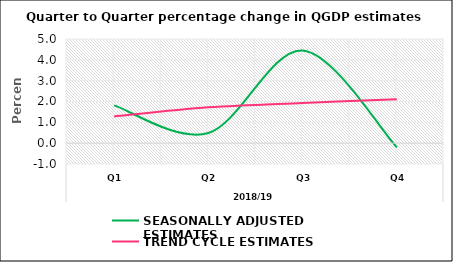
| Category | SEASONALLY ADJUSTED ESTIMATES | TREND CYCLE ESTIMATES |
|---|---|---|
| 0 | 1.815 | 1.282 |
| 1 | 0.487 | 1.72 |
| 2 | 4.45 | 1.933 |
| 3 | -0.201 | 2.107 |